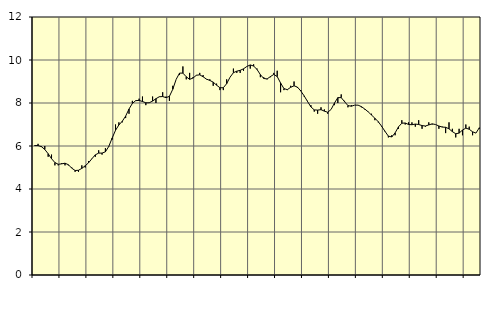
| Category | Piggar | Series 1 |
|---|---|---|
| nan | 6 | 6.02 |
| 87.0 | 6.1 | 6.02 |
| 87.0 | 6 | 5.97 |
| 87.0 | 6 | 5.84 |
| nan | 5.5 | 5.64 |
| 88.0 | 5.6 | 5.41 |
| 88.0 | 5.1 | 5.23 |
| 88.0 | 5.1 | 5.15 |
| nan | 5.2 | 5.17 |
| 89.0 | 5.1 | 5.2 |
| 89.0 | 5.1 | 5.13 |
| 89.0 | 5 | 4.97 |
| nan | 4.8 | 4.86 |
| 90.0 | 4.8 | 4.87 |
| 90.0 | 5.1 | 4.96 |
| 90.0 | 5 | 5.08 |
| nan | 5.3 | 5.22 |
| 91.0 | 5.4 | 5.41 |
| 91.0 | 5.5 | 5.59 |
| 91.0 | 5.8 | 5.67 |
| nan | 5.6 | 5.67 |
| 92.0 | 5.9 | 5.73 |
| 92.0 | 6 | 5.98 |
| 92.0 | 6.3 | 6.37 |
| nan | 7 | 6.73 |
| 93.0 | 7.1 | 6.98 |
| 93.0 | 7.1 | 7.15 |
| 93.0 | 7.3 | 7.39 |
| nan | 7.5 | 7.72 |
| 94.0 | 8.1 | 7.98 |
| 94.0 | 8.1 | 8.11 |
| 94.0 | 8.2 | 8.12 |
| nan | 8.3 | 8.07 |
| 95.0 | 7.9 | 8.01 |
| 95.0 | 8 | 8.01 |
| 95.0 | 8.3 | 8.09 |
| nan | 8 | 8.2 |
| 96.0 | 8.3 | 8.29 |
| 96.0 | 8.5 | 8.3 |
| 96.0 | 8.3 | 8.25 |
| nan | 8.1 | 8.31 |
| 97.0 | 8.8 | 8.64 |
| 97.0 | 9.1 | 9.1 |
| 97.0 | 9.3 | 9.39 |
| nan | 9.7 | 9.39 |
| 98.0 | 9.1 | 9.22 |
| 98.0 | 9.4 | 9.1 |
| 98.0 | 9.2 | 9.16 |
| nan | 9.3 | 9.29 |
| 99.0 | 9.4 | 9.31 |
| 99.0 | 9.3 | 9.22 |
| 99.0 | 9.1 | 9.11 |
| nan | 9.1 | 9.05 |
| 0.0 | 8.8 | 8.97 |
| 0.0 | 8.9 | 8.83 |
| 0.0 | 8.6 | 8.71 |
| nan | 8.6 | 8.71 |
| 1.0 | 9.1 | 8.9 |
| 1.0 | 9.2 | 9.2 |
| 1.0 | 9.6 | 9.41 |
| nan | 9.4 | 9.48 |
| 2.0 | 9.4 | 9.52 |
| 2.0 | 9.5 | 9.59 |
| 2.0 | 9.7 | 9.7 |
| nan | 9.6 | 9.77 |
| 3.0 | 9.8 | 9.72 |
| 3.0 | 9.6 | 9.56 |
| 3.0 | 9.2 | 9.32 |
| nan | 9.2 | 9.14 |
| 4.0 | 9.1 | 9.12 |
| 4.0 | 9.2 | 9.23 |
| 4.0 | 9.4 | 9.33 |
| nan | 9.5 | 9.23 |
| 5.0 | 8.5 | 8.93 |
| 5.0 | 8.6 | 8.67 |
| 5.0 | 8.6 | 8.62 |
| nan | 8.8 | 8.73 |
| 6.0 | 9 | 8.8 |
| 6.0 | 8.7 | 8.74 |
| 6.0 | 8.6 | 8.56 |
| nan | 8.3 | 8.33 |
| 7.0 | 8.1 | 8.07 |
| 7.0 | 7.9 | 7.82 |
| 7.0 | 7.6 | 7.68 |
| nan | 7.5 | 7.67 |
| 8.0 | 7.8 | 7.69 |
| 8.0 | 7.7 | 7.62 |
| 8.0 | 7.5 | 7.57 |
| nan | 7.7 | 7.7 |
| 9.0 | 7.9 | 8 |
| 9.0 | 8 | 8.25 |
| 9.0 | 8.4 | 8.25 |
| nan | 8.1 | 8.06 |
| 10.0 | 7.8 | 7.88 |
| 10.0 | 7.9 | 7.85 |
| 10.0 | 7.9 | 7.9 |
| nan | 7.9 | 7.9 |
| 11.0 | 7.8 | 7.83 |
| 11.0 | 7.7 | 7.72 |
| 11.0 | 7.6 | 7.59 |
| nan | 7.5 | 7.44 |
| 12.0 | 7.2 | 7.29 |
| 12.0 | 7.1 | 7.13 |
| 12.0 | 6.9 | 6.92 |
| nan | 6.7 | 6.68 |
| 13.0 | 6.4 | 6.46 |
| 13.0 | 6.5 | 6.42 |
| 13.0 | 6.5 | 6.61 |
| nan | 6.8 | 6.89 |
| 14.0 | 7.2 | 7.06 |
| 14.0 | 7 | 7.07 |
| 14.0 | 7.1 | 7 |
| nan | 7.1 | 6.99 |
| 15.0 | 6.9 | 7.02 |
| 15.0 | 7.2 | 7 |
| 15.0 | 6.8 | 6.95 |
| nan | 6.9 | 6.93 |
| 16.0 | 7.1 | 6.98 |
| 16.0 | 7 | 7.03 |
| 16.0 | 7 | 7 |
| nan | 6.8 | 6.93 |
| 17.0 | 6.9 | 6.88 |
| 17.0 | 6.6 | 6.87 |
| 17.0 | 7.1 | 6.8 |
| nan | 6.8 | 6.67 |
| 18.0 | 6.4 | 6.57 |
| 18.0 | 6.8 | 6.6 |
| 18.0 | 6.5 | 6.74 |
| nan | 7 | 6.83 |
| 19.0 | 6.9 | 6.78 |
| 19.0 | 6.5 | 6.66 |
| 19.0 | 6.6 | 6.6 |
| nan | 6.8 | 6.85 |